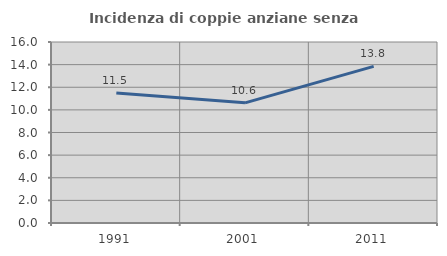
| Category | Incidenza di coppie anziane senza figli  |
|---|---|
| 1991.0 | 11.502 |
| 2001.0 | 10.624 |
| 2011.0 | 13.842 |